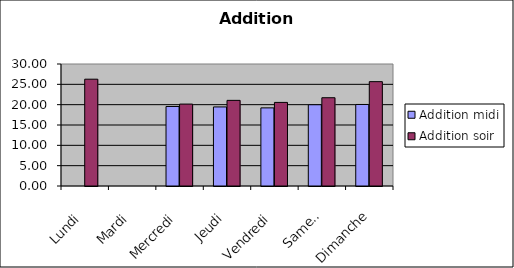
| Category | Addition |
|---|---|
| Lundi | 26.262 |
| Mardi | 0 |
| Mercredi | 20.144 |
| Jeudi | 21.058 |
| Vendredi | 20.555 |
| Samedi | 21.708 |
| Dimanche | 25.66 |